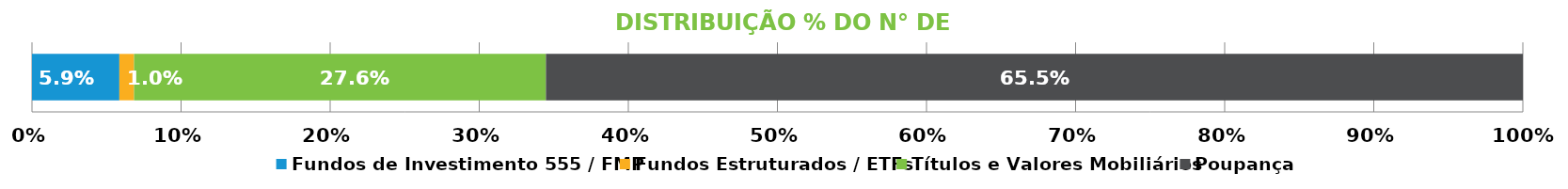
| Category | Fundos de Investimento 555 / FMP | Fundos Estruturados / ETFs | Títulos e Valores Mobiliários | Poupança |
|---|---|---|---|---|
| 0 | 0.059 | 0.01 | 0.276 | 0.655 |